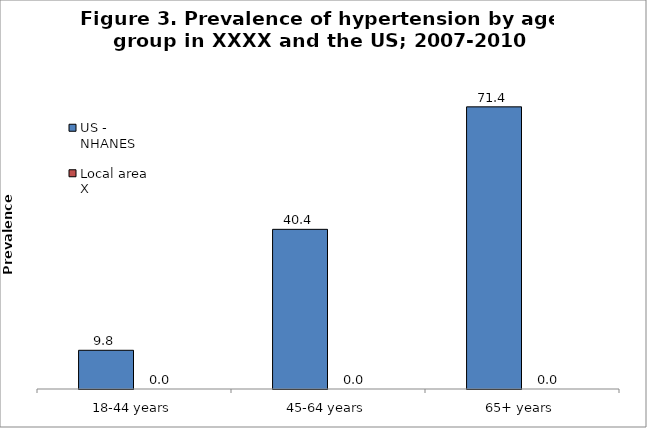
| Category | US - NHANES | Local area X |
|---|---|---|
| 18-44 years | 9.8 | 0 |
| 45-64 years | 40.42 | 0 |
| 65+ years | 71.43 | 0 |